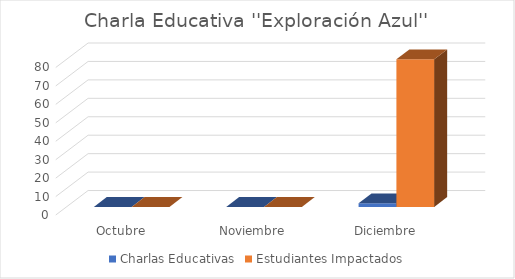
| Category | Charlas Educativas | Estudiantes Impactados |
|---|---|---|
| Octubre | 0 | 0 |
| Noviembre | 0 | 0 |
| Diciembre | 2 | 80 |